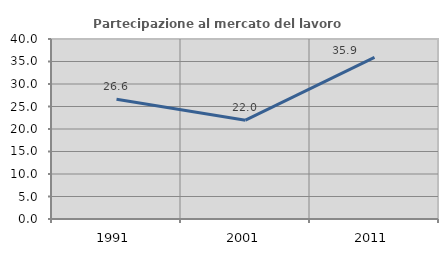
| Category | Partecipazione al mercato del lavoro  femminile |
|---|---|
| 1991.0 | 26.613 |
| 2001.0 | 21.951 |
| 2011.0 | 35.915 |